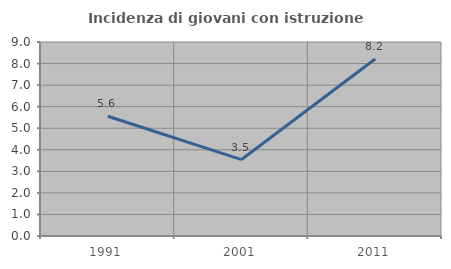
| Category | Incidenza di giovani con istruzione universitaria |
|---|---|
| 1991.0 | 5.556 |
| 2001.0 | 3.546 |
| 2011.0 | 8.209 |